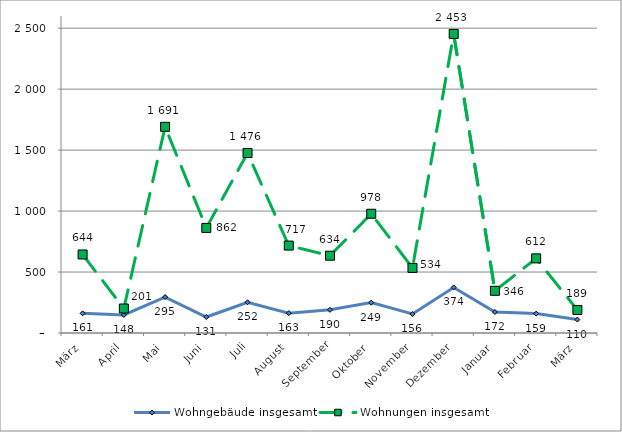
| Category | Wohngebäude insgesamt | Wohnungen insgesamt |
|---|---|---|
| März | 161 | 644 |
| April | 148 | 201 |
| Mai | 295 | 1691 |
| Juni | 131 | 862 |
| Juli | 252 | 1476 |
| August | 163 | 717 |
| September | 190 | 634 |
| Oktober | 249 | 978 |
| November | 156 | 534 |
| Dezember | 374 | 2453 |
| Januar | 172 | 346 |
| Februar | 159 | 612 |
| März | 110 | 189 |